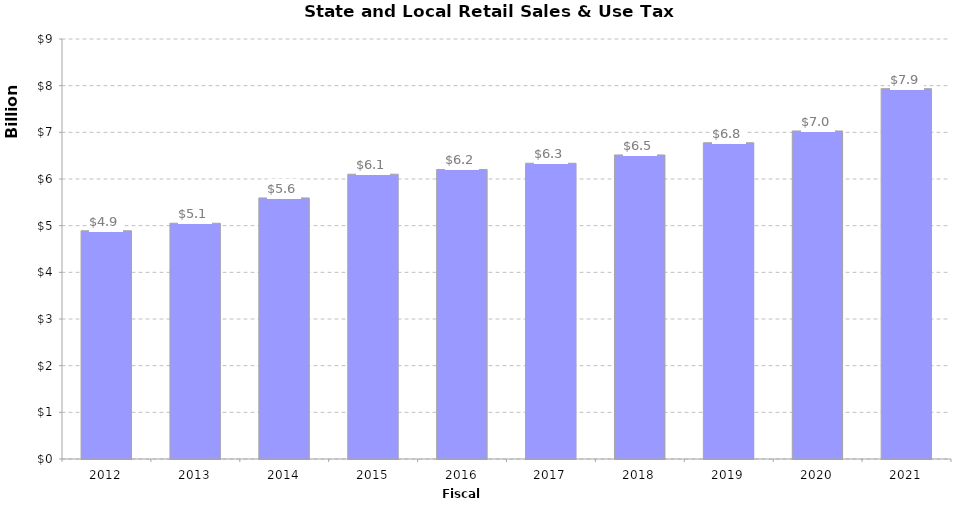
| Category | Series 0 |
|---|---|
| 2012.0 | 4891193000 |
| 2013.0 | 5052117000 |
| 2014.0 | 5594644000 |
| 2015.0 | 6102277000 |
| 2016.0 | 6204518000 |
| 2017.0 | 6337800000 |
| 2018.0 | 6515598000 |
| 2019.0 | 6776635000 |
| 2020.0 | 7029632000 |
| 2021.0 | 7935765000 |